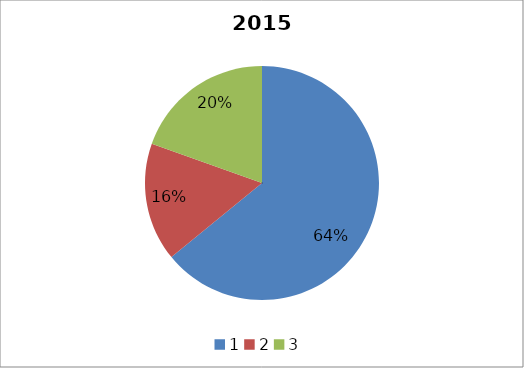
| Category | 2014 Breakdown |
|---|---|
| 0 | 0.641 |
| 1 | 0.164 |
| 2 | 0.195 |